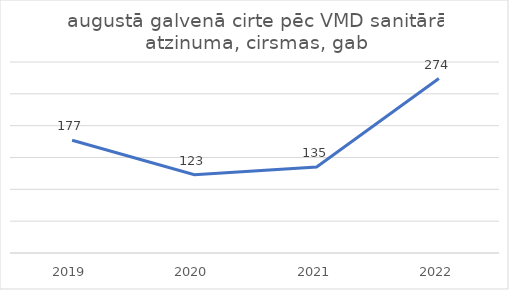
| Category | augustā galvenā cirte pēc VMD sanitārā atzinuma, cirsmas, gab |
|---|---|
| 2019.0 | 177 |
| 2020.0 | 123 |
| 2021.0 | 135 |
| 2022.0 | 274 |